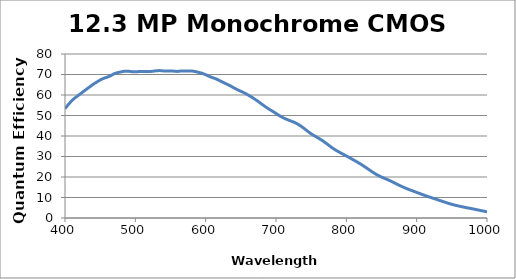
| Category | Quantum Efficiency (%) |
|---|---|
| 400.0 | 53.334 |
| 405.0 | 55.444 |
| 410.0 | 57.342 |
| 415.0 | 58.804 |
| 420.0 | 60.073 |
| 425.0 | 61.389 |
| 430.0 | 62.693 |
| 435.0 | 63.92 |
| 440.0 | 65.192 |
| 445.0 | 66.278 |
| 450.0 | 67.305 |
| 455.0 | 68.13 |
| 460.0 | 68.724 |
| 465.0 | 69.416 |
| 470.0 | 70.374 |
| 475.0 | 70.919 |
| 480.0 | 71.288 |
| 485.0 | 71.61 |
| 490.0 | 71.596 |
| 495.0 | 71.396 |
| 500.0 | 71.321 |
| 505.0 | 71.42 |
| 510.0 | 71.43 |
| 515.0 | 71.411 |
| 520.0 | 71.423 |
| 525.0 | 71.604 |
| 530.0 | 71.817 |
| 535.0 | 71.899 |
| 540.0 | 71.737 |
| 545.0 | 71.672 |
| 550.0 | 71.734 |
| 555.0 | 71.62 |
| 560.0 | 71.51 |
| 565.0 | 71.711 |
| 570.0 | 71.763 |
| 575.0 | 71.723 |
| 580.0 | 71.699 |
| 585.0 | 71.448 |
| 590.0 | 71.011 |
| 595.0 | 70.571 |
| 600.0 | 69.897 |
| 605.0 | 69.083 |
| 610.0 | 68.439 |
| 615.0 | 67.825 |
| 620.0 | 67.006 |
| 625.0 | 66.114 |
| 630.0 | 65.303 |
| 635.0 | 64.462 |
| 640.0 | 63.512 |
| 645.0 | 62.604 |
| 650.0 | 61.82 |
| 655.0 | 61.017 |
| 660.0 | 60.073 |
| 665.0 | 59.051 |
| 670.0 | 57.95 |
| 675.0 | 56.767 |
| 680.0 | 55.497 |
| 685.0 | 54.27 |
| 690.0 | 53.117 |
| 695.0 | 52.097 |
| 700.0 | 51.008 |
| 705.0 | 49.888 |
| 710.0 | 48.944 |
| 715.0 | 48.165 |
| 720.0 | 47.464 |
| 725.0 | 46.806 |
| 730.0 | 45.973 |
| 735.0 | 44.927 |
| 740.0 | 43.668 |
| 745.0 | 42.33 |
| 750.0 | 41.058 |
| 755.0 | 40.027 |
| 760.0 | 39.031 |
| 765.0 | 37.98 |
| 770.0 | 36.762 |
| 775.0 | 35.483 |
| 780.0 | 34.208 |
| 785.0 | 33.101 |
| 790.0 | 32.117 |
| 795.0 | 31.201 |
| 800.0 | 30.281 |
| 805.0 | 29.324 |
| 810.0 | 28.357 |
| 815.0 | 27.385 |
| 820.0 | 26.368 |
| 825.0 | 25.269 |
| 830.0 | 24.122 |
| 835.0 | 22.911 |
| 840.0 | 21.788 |
| 845.0 | 20.815 |
| 850.0 | 19.979 |
| 855.0 | 19.236 |
| 860.0 | 18.507 |
| 865.0 | 17.706 |
| 870.0 | 16.842 |
| 875.0 | 15.989 |
| 880.0 | 15.193 |
| 885.0 | 14.458 |
| 890.0 | 13.774 |
| 895.0 | 13.137 |
| 900.0 | 12.503 |
| 905.0 | 11.848 |
| 910.0 | 11.204 |
| 915.0 | 10.604 |
| 920.0 | 10.029 |
| 925.0 | 9.452 |
| 930.0 | 8.878 |
| 935.0 | 8.299 |
| 940.0 | 7.722 |
| 945.0 | 7.172 |
| 950.0 | 6.672 |
| 955.0 | 6.22 |
| 960.0 | 5.823 |
| 965.0 | 5.457 |
| 970.0 | 5.108 |
| 975.0 | 4.772 |
| 980.0 | 4.436 |
| 985.0 | 4.084 |
| 990.0 | 3.731 |
| 995.0 | 3.368 |
| 1000.0 | 3.004 |